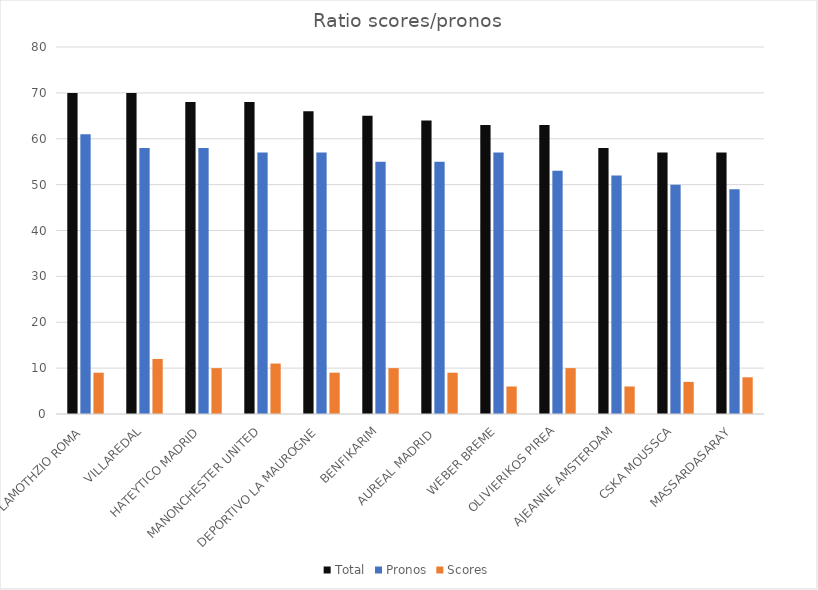
| Category | Total | Pronos | Scores |
|---|---|---|---|
| LAMOTHZIO ROMA | 70 | 61 | 9 |
| VILLAREDAL | 70 | 58 | 12 |
| HATEYTICO MADRID | 68 | 58 | 10 |
| MANONCHESTER UNITED | 68 | 57 | 11 |
| DEPORTIVO LA MAUROGNE | 66 | 57 | 9 |
| BENFIKARIM | 65 | 55 | 10 |
| AUREAL MADRID  | 64 | 55 | 9 |
| WEBER BREME | 63 | 57 | 6 |
| OLIVIERIKOS PIREA | 63 | 53 | 10 |
| AJEANNE AMSTERDAM | 58 | 52 | 6 |
| CSKA MOUSSCA | 57 | 50 | 7 |
| MASSARDASARAY | 57 | 49 | 8 |